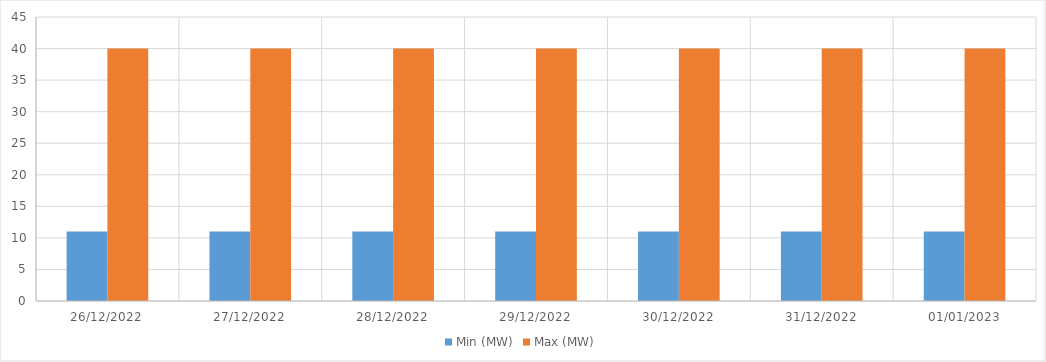
| Category | Min (MW) | Max (MW) |
|---|---|---|
| 26/12/2022 | 11 | 40 |
| 27/12/2022 | 11 | 40 |
| 28/12/2022 | 11 | 40 |
| 29/12/2022 | 11 | 40 |
| 30/12/2022 | 11 | 40 |
| 31/12/2022 | 11 | 40 |
| 01/01/2023 | 11 | 40 |